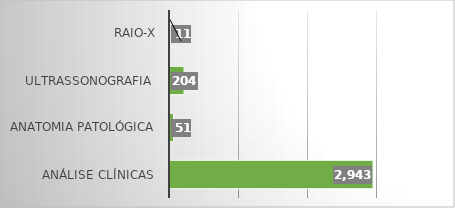
| Category | Series 0 |
|---|---|
| Análise Clínicas  | 2943 |
| Anatomia Patológica | 51 |
| Ultrassonografia  | 204 |
| RAIO-X | 11 |